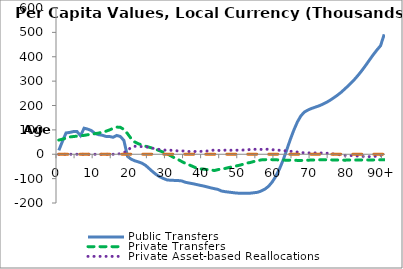
| Category | Public Transfers | Private Transfers | Private Asset-based Reallocations | Public Asset-based Reallocations |
|---|---|---|---|---|
| 0 | 15883.137 | 58275.189 | -25.315 | 25.31 |
|  | 52785.432 | 61639.9 | -26.794 | 26.789 |
| 2 | 87266.266 | 66619.622 | -28.968 | 28.963 |
| 3 | 89450.248 | 70841.164 | -30.806 | 30.81 |
| 4 | 93013.034 | 72655.178 | -31.621 | 31.619 |
| 5 | 93633.809 | 74037.637 | -32.245 | 32.246 |
| 6 | 76191.667 | 75578.374 | -32.944 | 32.94 |
| 7 | 106880.287 | 77437.011 | -33.773 | 33.765 |
| 8 | 103016.372 | 80081.127 | -34.913 | 34.924 |
| 9 | 97203.544 | 82260.114 | -35.883 | 35.874 |
| 10 | 85462.09 | 84545.144 | -36.857 | 36.867 |
| 11 | 80293.855 | 86859.611 | -37.883 | 37.885 |
| 12 | 78032.692 | 90238.988 | -39.368 | 39.379 |
| 13 | 73322.283 | 94269.683 | -41.181 | 41.175 |
| 14 | 73021.655 | 99604.568 | -43.598 | 43.593 |
| 15 | 69693.691 | 106084.814 | -46.684 | 46.68 |
| 16 | 77171.233 | 111465.145 | 872.874 | 51.155 |
| 17 | 73010.614 | 110672.149 | 1966.43 | 58.922 |
| 18 | 56867.639 | 101827.724 | 5975.261 | 70.292 |
| 19 | -8687.122 | 84703.297 | 16026.759 | 83.893 |
| 20 | -20081.133 | 64386.022 | 27947.583 | 98.403 |
| 21 | -26771.173 | 50516.431 | 32746.331 | 112.614 |
| 22 | -31298.19 | 43148.086 | 32093.771 | 125.409 |
| 23 | -36670.223 | 37900.129 | 31191.044 | 136.488 |
| 24 | -45587.951 | 32974.85 | 30568.905 | 146.963 |
| 25 | -58791.034 | 28890.887 | 28095.66 | 157.598 |
| 26 | -72105.511 | 24637.715 | 24457.291 | 168.074 |
| 27 | -83848.302 | 19216.539 | 21698.886 | 177.883 |
| 28 | -92990.464 | 13765.493 | 19225.418 | 186.768 |
| 29 | -99944.696 | 7784.426 | 17594.52 | 194.154 |
| 30 | -105508.148 | 1730.775 | 16031.804 | 199.593 |
| 31 | -106667.584 | -6910.873 | 16365.149 | 203.245 |
| 32 | -107317.646 | -14656.483 | 15270.468 | 205.911 |
| 33 | -107908.635 | -21582.533 | 13590.893 | 207.884 |
| 34 | -109424.529 | -29781.353 | 13680.739 | 209.546 |
| 35 | -115051.341 | -37466.475 | 13305.542 | 211.235 |
| 36 | -117936.046 | -43280.598 | 11272.976 | 212.663 |
| 37 | -120689.381 | -49530.566 | 10606.322 | 213.688 |
| 38 | -123841.451 | -56284.403 | 11711.585 | 214.799 |
| 39 | -127223.248 | -60166.142 | 12049.673 | 216.179 |
| 40 | -130253.521 | -60916.877 | 11625.642 | 217.791 |
| 41 | -133818.281 | -62902.46 | 13360.019 | 219.949 |
| 42 | -137737.692 | -63628.594 | 13988.847 | 222.487 |
| 43 | -141078.735 | -66973.089 | 17901.769 | 224.562 |
| 44 | -144212.559 | -63181.203 | 15828.657 | 226.425 |
| 45 | -150826.447 | -59817.001 | 15080.097 | 228.451 |
| 46 | -153484.058 | -58390.807 | 16780.673 | 229.991 |
| 47 | -155289.278 | -54658.799 | 16507.082 | 231.101 |
| 48 | -157207.274 | -51154.527 | 16388.768 | 232.896 |
| 49 | -158954.788 | -48177.86 | 16544.557 | 234.861 |
| 50 | -160017.004 | -45131.833 | 16982.332 | 236.395 |
| 51 | -160446.761 | -40927.865 | 17373.838 | 238.116 |
| 52 | -160311.929 | -36290.26 | 17637.353 | 239.735 |
| 53 | -159626.311 | -33737.959 | 19803.533 | 241.189 |
| 54 | -157913.252 | -29539.536 | 20210.393 | 242.636 |
| 55 | -156041.943 | -26269.762 | 20438.565 | 243.688 |
| 56 | -150680.426 | -23159.334 | 19824.481 | 244.503 |
| 57 | -143150.997 | -22279.738 | 20712.231 | 245.198 |
| 58 | -131791.393 | -21902.828 | 20458.827 | 244.851 |
| 59 | -114307.758 | -22187.539 | 18879.427 | 242.584 |
| 60 | -91216.661 | -22468.406 | 16880.26 | 238.233 |
| 61 | -61678.605 | -23806.33 | 16452.487 | 230.738 |
| 62 | -25900.457 | -23870.074 | 15066.096 | 220.673 |
| 63 | 15915.221 | -24339.67 | 13871.078 | 209.577 |
| 64 | 59383.496 | -24176.221 | 12152.877 | 198.303 |
| 65 | 98726.082 | -24769.159 | 11156.146 | 187.842 |
| 66 | 132849.771 | -25220.126 | 8804.535 | 179.106 |
| 67 | 158454.137 | -25370.4 | 6353.226 | 171.157 |
| 68 | 173713.79 | -25048.668 | 6060.473 | 163.618 |
| 69 | 182158.268 | -24207.423 | 5617.715 | 156.689 |
| 70 | 188428.385 | -23911.62 | 5125.977 | 150.354 |
| 71 | 193529.426 | -23377.982 | 5365.894 | 145.161 |
| 72 | 198796.261 | -22900.119 | 5595.109 | 141.513 |
| 73 | 205158.27 | -22313.622 | 4727.604 | 138.625 |
| 74 | 212627.29 | -22755.845 | 4223.21 | 135.982 |
| 75 | 221187.089 | -22898.966 | 2980.127 | 133.556 |
| 76 | 231133.547 | -23353.089 | 1226.91 | 131.011 |
| 77 | 241570.604 | -23588.81 | -742.548 | 128.426 |
| 78 | 253080.455 | -23989.296 | -2479.841 | 126.326 |
| 79 | 266376.586 | -24206.756 | -4380.379 | 124.603 |
| 80 | 280202.653 | -24003.218 | -4678.05 | 123.552 |
| 81 | 294657.951 | -23498.594 | -5294.441 | 122.712 |
| 82 | 310445.922 | -23657.178 | -6185.642 | 122.664 |
| 83 | 327893.459 | -23701.091 | -7644.684 | 122.788 |
| 84 | 346741.728 | -23598.242 | -8832.524 | 122.887 |
| 85 | 367057.546 | -23375.03 | -9769.068 | 122.52 |
| 86 | 388228.046 | -23524.672 | -9859.474 | 121.002 |
| 87 | 408838.507 | -23293.305 | -9365.594 | 118.554 |
| 88 | 427893.573 | -23035.226 | -7768.748 | 115.921 |
| 89 | 445450.395 | -22882.512 | -5699.986 | 112.924 |
| 90+ | 491796.8 | -22604.387 | 3388.728 | 106.863 |